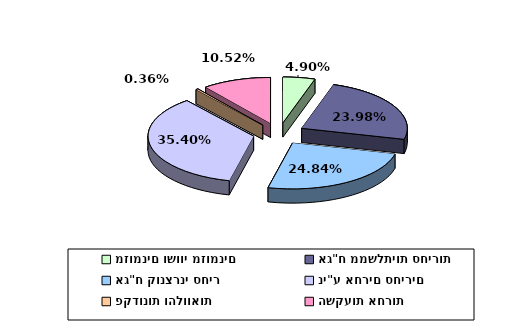
| Category | Series 0 |
|---|---|
| מזומנים ושווי מזומנים | 0.049 |
| אג"ח ממשלתיות סחירות | 0.24 |
| אג"ח קונצרני סחיר | 0.248 |
| ני"ע אחרים סחירים | 0.354 |
| פקדונות והלוואות | 0.004 |
| השקעות אחרות | 0.105 |